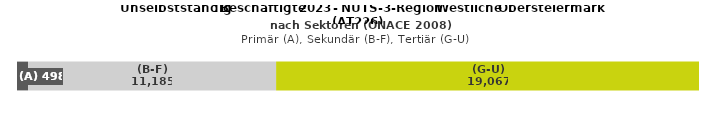
| Category | (A) | (B-F) | (G-U) |
|---|---|---|---|
| 0 | 498 | 11185 | 19067 |